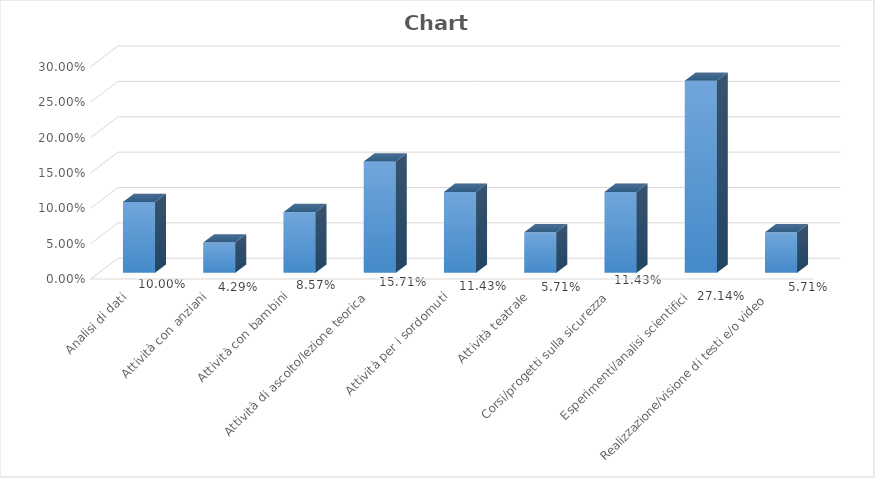
| Category | Series 0 |
|---|---|
| Analisi di dati | 0.1 |
| Attività con anziani | 0.043 |
| Attività con bambini | 0.086 |
| Attività di ascolto/lezione teorica | 0.157 |
| Attività per i sordomuti | 0.114 |
| Attività teatrale | 0.057 |
| Corsi/progetti sulla sicurezza | 0.114 |
| Esperimenti/analisi scientifici | 0.271 |
| Realizzazione/visione di testi e/o video | 0.057 |